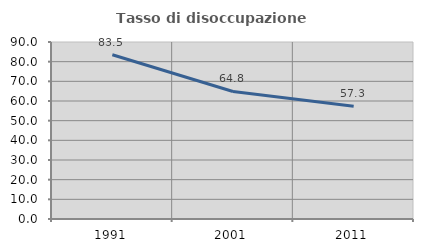
| Category | Tasso di disoccupazione giovanile  |
|---|---|
| 1991.0 | 83.531 |
| 2001.0 | 64.848 |
| 2011.0 | 57.317 |